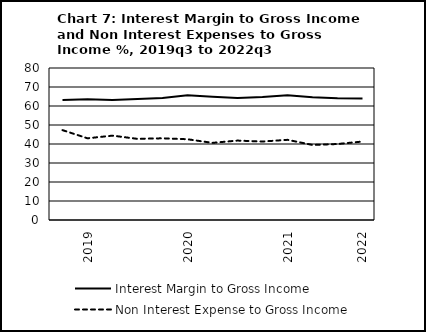
| Category | Interest Margin to Gross Income | Non Interest Expense to Gross Income |
|---|---|---|
| nan | 63.2 | 47.3 |
| 2019.0 | 63.5 | 43 |
| nan | 63.1 | 44.4 |
| nan | 63.7 | 42.7 |
| nan | 64.2 | 43 |
| 2020.0 | 65.7 | 42.5 |
| nan | 64.9 | 40.6 |
| nan | 64.2 | 41.8 |
| nan | 64.7 | 41.3 |
| 2021.0 | 65.6 | 42.2 |
| nan | 64.6 | 39.5 |
| nan | 64.1 | 40 |
| 2022.0 | 64 | 41.3 |